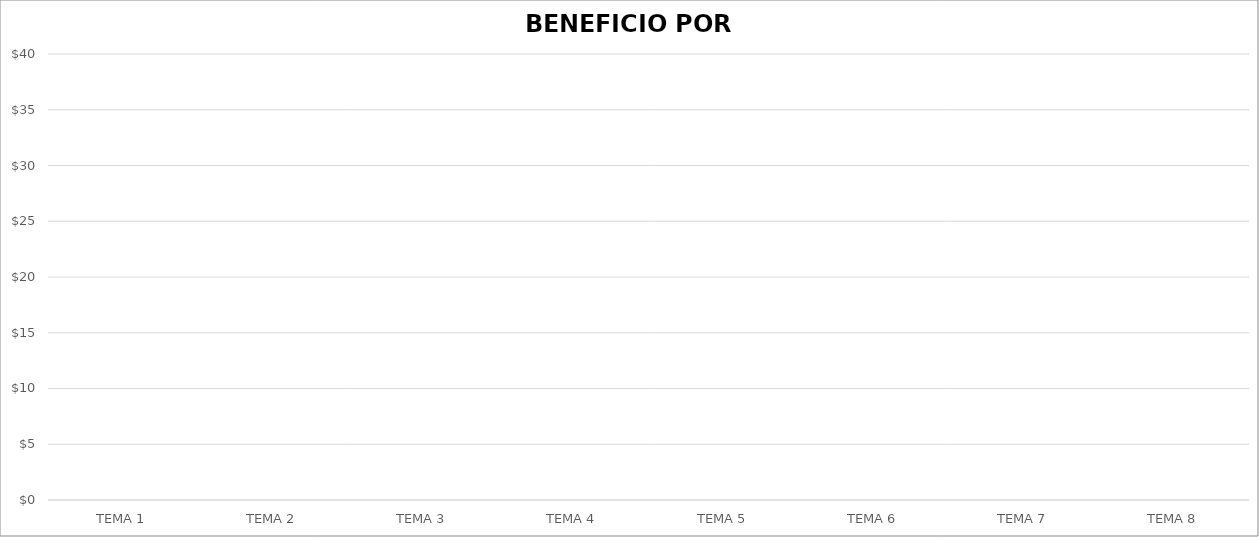
| Category | BENEFICIO POR ARTÍCULO |
|---|---|
| TEMA 1 | 0 |
| TEMA 2 | 0 |
| TEMA 3 | 0 |
| TEMA 4 | 0 |
| TEMA 5 | 0 |
| TEMA 6 | 0 |
| TEMA 7 | 0 |
| TEMA 8 | 0 |